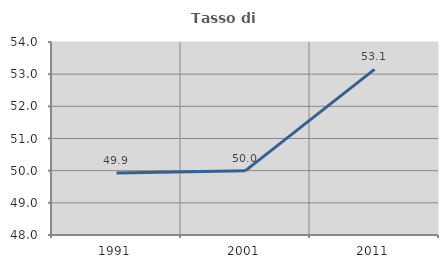
| Category | Tasso di occupazione   |
|---|---|
| 1991.0 | 49.931 |
| 2001.0 | 50 |
| 2011.0 | 53.15 |